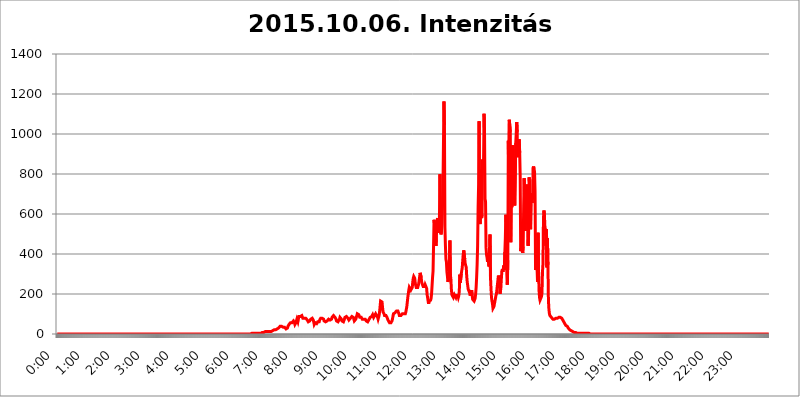
| Category | 2015.10.06. Intenzitás [W/m^2] |
|---|---|
| 0.0 | 0 |
| 0.0006944444444444445 | 0 |
| 0.001388888888888889 | 0 |
| 0.0020833333333333333 | 0 |
| 0.002777777777777778 | 0 |
| 0.003472222222222222 | 0 |
| 0.004166666666666667 | 0 |
| 0.004861111111111111 | 0 |
| 0.005555555555555556 | 0 |
| 0.0062499999999999995 | 0 |
| 0.006944444444444444 | 0 |
| 0.007638888888888889 | 0 |
| 0.008333333333333333 | 0 |
| 0.009027777777777779 | 0 |
| 0.009722222222222222 | 0 |
| 0.010416666666666666 | 0 |
| 0.011111111111111112 | 0 |
| 0.011805555555555555 | 0 |
| 0.012499999999999999 | 0 |
| 0.013194444444444444 | 0 |
| 0.013888888888888888 | 0 |
| 0.014583333333333332 | 0 |
| 0.015277777777777777 | 0 |
| 0.015972222222222224 | 0 |
| 0.016666666666666666 | 0 |
| 0.017361111111111112 | 0 |
| 0.018055555555555557 | 0 |
| 0.01875 | 0 |
| 0.019444444444444445 | 0 |
| 0.02013888888888889 | 0 |
| 0.020833333333333332 | 0 |
| 0.02152777777777778 | 0 |
| 0.022222222222222223 | 0 |
| 0.02291666666666667 | 0 |
| 0.02361111111111111 | 0 |
| 0.024305555555555556 | 0 |
| 0.024999999999999998 | 0 |
| 0.025694444444444447 | 0 |
| 0.02638888888888889 | 0 |
| 0.027083333333333334 | 0 |
| 0.027777777777777776 | 0 |
| 0.02847222222222222 | 0 |
| 0.029166666666666664 | 0 |
| 0.029861111111111113 | 0 |
| 0.030555555555555555 | 0 |
| 0.03125 | 0 |
| 0.03194444444444445 | 0 |
| 0.03263888888888889 | 0 |
| 0.03333333333333333 | 0 |
| 0.034027777777777775 | 0 |
| 0.034722222222222224 | 0 |
| 0.035416666666666666 | 0 |
| 0.036111111111111115 | 0 |
| 0.03680555555555556 | 0 |
| 0.0375 | 0 |
| 0.03819444444444444 | 0 |
| 0.03888888888888889 | 0 |
| 0.03958333333333333 | 0 |
| 0.04027777777777778 | 0 |
| 0.04097222222222222 | 0 |
| 0.041666666666666664 | 0 |
| 0.042361111111111106 | 0 |
| 0.04305555555555556 | 0 |
| 0.043750000000000004 | 0 |
| 0.044444444444444446 | 0 |
| 0.04513888888888889 | 0 |
| 0.04583333333333334 | 0 |
| 0.04652777777777778 | 0 |
| 0.04722222222222222 | 0 |
| 0.04791666666666666 | 0 |
| 0.04861111111111111 | 0 |
| 0.049305555555555554 | 0 |
| 0.049999999999999996 | 0 |
| 0.05069444444444445 | 0 |
| 0.051388888888888894 | 0 |
| 0.052083333333333336 | 0 |
| 0.05277777777777778 | 0 |
| 0.05347222222222222 | 0 |
| 0.05416666666666667 | 0 |
| 0.05486111111111111 | 0 |
| 0.05555555555555555 | 0 |
| 0.05625 | 0 |
| 0.05694444444444444 | 0 |
| 0.057638888888888885 | 0 |
| 0.05833333333333333 | 0 |
| 0.05902777777777778 | 0 |
| 0.059722222222222225 | 0 |
| 0.06041666666666667 | 0 |
| 0.061111111111111116 | 0 |
| 0.06180555555555556 | 0 |
| 0.0625 | 0 |
| 0.06319444444444444 | 0 |
| 0.06388888888888888 | 0 |
| 0.06458333333333334 | 0 |
| 0.06527777777777778 | 0 |
| 0.06597222222222222 | 0 |
| 0.06666666666666667 | 0 |
| 0.06736111111111111 | 0 |
| 0.06805555555555555 | 0 |
| 0.06874999999999999 | 0 |
| 0.06944444444444443 | 0 |
| 0.07013888888888889 | 0 |
| 0.07083333333333333 | 0 |
| 0.07152777777777779 | 0 |
| 0.07222222222222223 | 0 |
| 0.07291666666666667 | 0 |
| 0.07361111111111111 | 0 |
| 0.07430555555555556 | 0 |
| 0.075 | 0 |
| 0.07569444444444444 | 0 |
| 0.0763888888888889 | 0 |
| 0.07708333333333334 | 0 |
| 0.07777777777777778 | 0 |
| 0.07847222222222222 | 0 |
| 0.07916666666666666 | 0 |
| 0.0798611111111111 | 0 |
| 0.08055555555555556 | 0 |
| 0.08125 | 0 |
| 0.08194444444444444 | 0 |
| 0.08263888888888889 | 0 |
| 0.08333333333333333 | 0 |
| 0.08402777777777777 | 0 |
| 0.08472222222222221 | 0 |
| 0.08541666666666665 | 0 |
| 0.08611111111111112 | 0 |
| 0.08680555555555557 | 0 |
| 0.08750000000000001 | 0 |
| 0.08819444444444445 | 0 |
| 0.08888888888888889 | 0 |
| 0.08958333333333333 | 0 |
| 0.09027777777777778 | 0 |
| 0.09097222222222222 | 0 |
| 0.09166666666666667 | 0 |
| 0.09236111111111112 | 0 |
| 0.09305555555555556 | 0 |
| 0.09375 | 0 |
| 0.09444444444444444 | 0 |
| 0.09513888888888888 | 0 |
| 0.09583333333333333 | 0 |
| 0.09652777777777777 | 0 |
| 0.09722222222222222 | 0 |
| 0.09791666666666667 | 0 |
| 0.09861111111111111 | 0 |
| 0.09930555555555555 | 0 |
| 0.09999999999999999 | 0 |
| 0.10069444444444443 | 0 |
| 0.1013888888888889 | 0 |
| 0.10208333333333335 | 0 |
| 0.10277777777777779 | 0 |
| 0.10347222222222223 | 0 |
| 0.10416666666666667 | 0 |
| 0.10486111111111111 | 0 |
| 0.10555555555555556 | 0 |
| 0.10625 | 0 |
| 0.10694444444444444 | 0 |
| 0.1076388888888889 | 0 |
| 0.10833333333333334 | 0 |
| 0.10902777777777778 | 0 |
| 0.10972222222222222 | 0 |
| 0.1111111111111111 | 0 |
| 0.11180555555555556 | 0 |
| 0.11180555555555556 | 0 |
| 0.1125 | 0 |
| 0.11319444444444444 | 0 |
| 0.11388888888888889 | 0 |
| 0.11458333333333333 | 0 |
| 0.11527777777777777 | 0 |
| 0.11597222222222221 | 0 |
| 0.11666666666666665 | 0 |
| 0.1173611111111111 | 0 |
| 0.11805555555555557 | 0 |
| 0.11944444444444445 | 0 |
| 0.12013888888888889 | 0 |
| 0.12083333333333333 | 0 |
| 0.12152777777777778 | 0 |
| 0.12222222222222223 | 0 |
| 0.12291666666666667 | 0 |
| 0.12291666666666667 | 0 |
| 0.12361111111111112 | 0 |
| 0.12430555555555556 | 0 |
| 0.125 | 0 |
| 0.12569444444444444 | 0 |
| 0.12638888888888888 | 0 |
| 0.12708333333333333 | 0 |
| 0.16875 | 0 |
| 0.12847222222222224 | 0 |
| 0.12916666666666668 | 0 |
| 0.12986111111111112 | 0 |
| 0.13055555555555556 | 0 |
| 0.13125 | 0 |
| 0.13194444444444445 | 0 |
| 0.1326388888888889 | 0 |
| 0.13333333333333333 | 0 |
| 0.13402777777777777 | 0 |
| 0.13402777777777777 | 0 |
| 0.13472222222222222 | 0 |
| 0.13541666666666666 | 0 |
| 0.1361111111111111 | 0 |
| 0.13749999999999998 | 0 |
| 0.13819444444444443 | 0 |
| 0.1388888888888889 | 0 |
| 0.13958333333333334 | 0 |
| 0.14027777777777778 | 0 |
| 0.14097222222222222 | 0 |
| 0.14166666666666666 | 0 |
| 0.1423611111111111 | 0 |
| 0.14305555555555557 | 0 |
| 0.14375000000000002 | 0 |
| 0.14444444444444446 | 0 |
| 0.1451388888888889 | 0 |
| 0.1451388888888889 | 0 |
| 0.14652777777777778 | 0 |
| 0.14722222222222223 | 0 |
| 0.14791666666666667 | 0 |
| 0.1486111111111111 | 0 |
| 0.14930555555555555 | 0 |
| 0.15 | 0 |
| 0.15069444444444444 | 0 |
| 0.15138888888888888 | 0 |
| 0.15208333333333332 | 0 |
| 0.15277777777777776 | 0 |
| 0.15347222222222223 | 0 |
| 0.15416666666666667 | 0 |
| 0.15486111111111112 | 0 |
| 0.15555555555555556 | 0 |
| 0.15625 | 0 |
| 0.15694444444444444 | 0 |
| 0.15763888888888888 | 0 |
| 0.15833333333333333 | 0 |
| 0.15902777777777777 | 0 |
| 0.15972222222222224 | 0 |
| 0.16041666666666668 | 0 |
| 0.16111111111111112 | 0 |
| 0.16180555555555556 | 0 |
| 0.1625 | 0 |
| 0.16319444444444445 | 0 |
| 0.1638888888888889 | 0 |
| 0.16458333333333333 | 0 |
| 0.16527777777777777 | 0 |
| 0.16597222222222222 | 0 |
| 0.16666666666666666 | 0 |
| 0.1673611111111111 | 0 |
| 0.16805555555555554 | 0 |
| 0.16874999999999998 | 0 |
| 0.16944444444444443 | 0 |
| 0.17013888888888887 | 0 |
| 0.1708333333333333 | 0 |
| 0.17152777777777775 | 0 |
| 0.17222222222222225 | 0 |
| 0.1729166666666667 | 0 |
| 0.17361111111111113 | 0 |
| 0.17430555555555557 | 0 |
| 0.17500000000000002 | 0 |
| 0.17569444444444446 | 0 |
| 0.1763888888888889 | 0 |
| 0.17708333333333334 | 0 |
| 0.17777777777777778 | 0 |
| 0.17847222222222223 | 0 |
| 0.17916666666666667 | 0 |
| 0.1798611111111111 | 0 |
| 0.18055555555555555 | 0 |
| 0.18125 | 0 |
| 0.18194444444444444 | 0 |
| 0.1826388888888889 | 0 |
| 0.18333333333333335 | 0 |
| 0.1840277777777778 | 0 |
| 0.18472222222222223 | 0 |
| 0.18541666666666667 | 0 |
| 0.18611111111111112 | 0 |
| 0.18680555555555556 | 0 |
| 0.1875 | 0 |
| 0.18819444444444444 | 0 |
| 0.18888888888888888 | 0 |
| 0.18958333333333333 | 0 |
| 0.19027777777777777 | 0 |
| 0.1909722222222222 | 0 |
| 0.19166666666666665 | 0 |
| 0.19236111111111112 | 0 |
| 0.19305555555555554 | 0 |
| 0.19375 | 0 |
| 0.19444444444444445 | 0 |
| 0.1951388888888889 | 0 |
| 0.19583333333333333 | 0 |
| 0.19652777777777777 | 0 |
| 0.19722222222222222 | 0 |
| 0.19791666666666666 | 0 |
| 0.1986111111111111 | 0 |
| 0.19930555555555554 | 0 |
| 0.19999999999999998 | 0 |
| 0.20069444444444443 | 0 |
| 0.20138888888888887 | 0 |
| 0.2020833333333333 | 0 |
| 0.2027777777777778 | 0 |
| 0.2034722222222222 | 0 |
| 0.2041666666666667 | 0 |
| 0.20486111111111113 | 0 |
| 0.20555555555555557 | 0 |
| 0.20625000000000002 | 0 |
| 0.20694444444444446 | 0 |
| 0.2076388888888889 | 0 |
| 0.20833333333333334 | 0 |
| 0.20902777777777778 | 0 |
| 0.20972222222222223 | 0 |
| 0.21041666666666667 | 0 |
| 0.2111111111111111 | 0 |
| 0.21180555555555555 | 0 |
| 0.2125 | 0 |
| 0.21319444444444444 | 0 |
| 0.2138888888888889 | 0 |
| 0.21458333333333335 | 0 |
| 0.2152777777777778 | 0 |
| 0.21597222222222223 | 0 |
| 0.21666666666666667 | 0 |
| 0.21736111111111112 | 0 |
| 0.21805555555555556 | 0 |
| 0.21875 | 0 |
| 0.21944444444444444 | 0 |
| 0.22013888888888888 | 0 |
| 0.22083333333333333 | 0 |
| 0.22152777777777777 | 0 |
| 0.2222222222222222 | 0 |
| 0.22291666666666665 | 0 |
| 0.2236111111111111 | 0 |
| 0.22430555555555556 | 0 |
| 0.225 | 0 |
| 0.22569444444444445 | 0 |
| 0.2263888888888889 | 0 |
| 0.22708333333333333 | 0 |
| 0.22777777777777777 | 0 |
| 0.22847222222222222 | 0 |
| 0.22916666666666666 | 0 |
| 0.2298611111111111 | 0 |
| 0.23055555555555554 | 0 |
| 0.23124999999999998 | 0 |
| 0.23194444444444443 | 0 |
| 0.23263888888888887 | 0 |
| 0.2333333333333333 | 0 |
| 0.2340277777777778 | 0 |
| 0.2347222222222222 | 0 |
| 0.2354166666666667 | 0 |
| 0.23611111111111113 | 0 |
| 0.23680555555555557 | 0 |
| 0.23750000000000002 | 0 |
| 0.23819444444444446 | 0 |
| 0.2388888888888889 | 0 |
| 0.23958333333333334 | 0 |
| 0.24027777777777778 | 0 |
| 0.24097222222222223 | 0 |
| 0.24166666666666667 | 0 |
| 0.2423611111111111 | 0 |
| 0.24305555555555555 | 0 |
| 0.24375 | 0 |
| 0.24444444444444446 | 0 |
| 0.24513888888888888 | 0 |
| 0.24583333333333335 | 0 |
| 0.2465277777777778 | 0 |
| 0.24722222222222223 | 0 |
| 0.24791666666666667 | 0 |
| 0.24861111111111112 | 0 |
| 0.24930555555555556 | 0 |
| 0.25 | 0 |
| 0.25069444444444444 | 0 |
| 0.2513888888888889 | 0 |
| 0.2520833333333333 | 0 |
| 0.25277777777777777 | 0 |
| 0.2534722222222222 | 0 |
| 0.25416666666666665 | 0 |
| 0.2548611111111111 | 0 |
| 0.2555555555555556 | 0 |
| 0.25625000000000003 | 0 |
| 0.2569444444444445 | 0 |
| 0.2576388888888889 | 0 |
| 0.25833333333333336 | 0 |
| 0.2590277777777778 | 0 |
| 0.25972222222222224 | 0 |
| 0.2604166666666667 | 0 |
| 0.2611111111111111 | 0 |
| 0.26180555555555557 | 0 |
| 0.2625 | 0 |
| 0.26319444444444445 | 0 |
| 0.2638888888888889 | 0 |
| 0.26458333333333334 | 0 |
| 0.2652777777777778 | 0 |
| 0.2659722222222222 | 0 |
| 0.26666666666666666 | 0 |
| 0.2673611111111111 | 0 |
| 0.26805555555555555 | 0 |
| 0.26875 | 0 |
| 0.26944444444444443 | 0 |
| 0.2701388888888889 | 0 |
| 0.2708333333333333 | 0 |
| 0.27152777777777776 | 0 |
| 0.2722222222222222 | 0 |
| 0.27291666666666664 | 3.525 |
| 0.2736111111111111 | 0 |
| 0.2743055555555555 | 3.525 |
| 0.27499999999999997 | 3.525 |
| 0.27569444444444446 | 3.525 |
| 0.27638888888888885 | 3.525 |
| 0.27708333333333335 | 3.525 |
| 0.2777777777777778 | 3.525 |
| 0.27847222222222223 | 3.525 |
| 0.2791666666666667 | 3.525 |
| 0.2798611111111111 | 3.525 |
| 0.28055555555555556 | 3.525 |
| 0.28125 | 3.525 |
| 0.28194444444444444 | 3.525 |
| 0.2826388888888889 | 3.525 |
| 0.2833333333333333 | 3.525 |
| 0.28402777777777777 | 3.525 |
| 0.2847222222222222 | 3.525 |
| 0.28541666666666665 | 3.525 |
| 0.28611111111111115 | 3.525 |
| 0.28680555555555554 | 7.887 |
| 0.28750000000000003 | 7.887 |
| 0.2881944444444445 | 7.887 |
| 0.2888888888888889 | 7.887 |
| 0.28958333333333336 | 7.887 |
| 0.2902777777777778 | 7.887 |
| 0.29097222222222224 | 7.887 |
| 0.2916666666666667 | 12.257 |
| 0.2923611111111111 | 12.257 |
| 0.29305555555555557 | 12.257 |
| 0.29375 | 12.257 |
| 0.29444444444444445 | 12.257 |
| 0.2951388888888889 | 12.257 |
| 0.29583333333333334 | 12.257 |
| 0.2965277777777778 | 12.257 |
| 0.2972222222222222 | 12.257 |
| 0.29791666666666666 | 12.257 |
| 0.2986111111111111 | 12.257 |
| 0.29930555555555555 | 12.257 |
| 0.3 | 12.257 |
| 0.30069444444444443 | 12.257 |
| 0.3013888888888889 | 16.636 |
| 0.3020833333333333 | 16.636 |
| 0.30277777777777776 | 16.636 |
| 0.3034722222222222 | 16.636 |
| 0.30416666666666664 | 21.024 |
| 0.3048611111111111 | 21.024 |
| 0.3055555555555555 | 21.024 |
| 0.30624999999999997 | 21.024 |
| 0.3069444444444444 | 21.024 |
| 0.3076388888888889 | 25.419 |
| 0.30833333333333335 | 25.419 |
| 0.3090277777777778 | 25.419 |
| 0.30972222222222223 | 29.823 |
| 0.3104166666666667 | 29.823 |
| 0.3111111111111111 | 29.823 |
| 0.31180555555555556 | 34.234 |
| 0.3125 | 38.653 |
| 0.31319444444444444 | 38.653 |
| 0.3138888888888889 | 38.653 |
| 0.3145833333333333 | 38.653 |
| 0.31527777777777777 | 38.653 |
| 0.3159722222222222 | 38.653 |
| 0.31666666666666665 | 34.234 |
| 0.31736111111111115 | 34.234 |
| 0.31805555555555554 | 34.234 |
| 0.31875000000000003 | 34.234 |
| 0.3194444444444445 | 29.823 |
| 0.3201388888888889 | 29.823 |
| 0.32083333333333336 | 25.419 |
| 0.3215277777777778 | 29.823 |
| 0.32222222222222224 | 29.823 |
| 0.3229166666666667 | 29.823 |
| 0.3236111111111111 | 38.653 |
| 0.32430555555555557 | 43.079 |
| 0.325 | 47.511 |
| 0.32569444444444445 | 47.511 |
| 0.3263888888888889 | 47.511 |
| 0.32708333333333334 | 56.398 |
| 0.3277777777777778 | 56.398 |
| 0.3284722222222222 | 56.398 |
| 0.32916666666666666 | 56.398 |
| 0.3298611111111111 | 56.398 |
| 0.33055555555555555 | 60.85 |
| 0.33125 | 65.31 |
| 0.33194444444444443 | 65.31 |
| 0.3326388888888889 | 56.398 |
| 0.3333333333333333 | 47.511 |
| 0.3340277777777778 | 47.511 |
| 0.3347222222222222 | 56.398 |
| 0.3354166666666667 | 65.31 |
| 0.3361111111111111 | 74.246 |
| 0.3368055555555556 | 74.246 |
| 0.33749999999999997 | 60.85 |
| 0.33819444444444446 | 74.246 |
| 0.33888888888888885 | 87.692 |
| 0.33958333333333335 | 87.692 |
| 0.34027777777777773 | 83.205 |
| 0.34097222222222223 | 87.692 |
| 0.3416666666666666 | 87.692 |
| 0.3423611111111111 | 87.692 |
| 0.3430555555555555 | 92.184 |
| 0.34375 | 87.692 |
| 0.3444444444444445 | 78.722 |
| 0.3451388888888889 | 78.722 |
| 0.3458333333333334 | 78.722 |
| 0.34652777777777777 | 78.722 |
| 0.34722222222222227 | 78.722 |
| 0.34791666666666665 | 83.205 |
| 0.34861111111111115 | 78.722 |
| 0.34930555555555554 | 74.246 |
| 0.35000000000000003 | 74.246 |
| 0.3506944444444444 | 69.775 |
| 0.3513888888888889 | 65.31 |
| 0.3520833333333333 | 60.85 |
| 0.3527777777777778 | 56.398 |
| 0.3534722222222222 | 60.85 |
| 0.3541666666666667 | 65.31 |
| 0.3548611111111111 | 65.31 |
| 0.35555555555555557 | 74.246 |
| 0.35625 | 74.246 |
| 0.35694444444444445 | 78.722 |
| 0.3576388888888889 | 78.722 |
| 0.35833333333333334 | 74.246 |
| 0.3590277777777778 | 69.775 |
| 0.3597222222222222 | 60.85 |
| 0.36041666666666666 | 47.511 |
| 0.3611111111111111 | 51.951 |
| 0.36180555555555555 | 56.398 |
| 0.3625 | 51.951 |
| 0.36319444444444443 | 51.951 |
| 0.3638888888888889 | 51.951 |
| 0.3645833333333333 | 56.398 |
| 0.3652777777777778 | 60.85 |
| 0.3659722222222222 | 60.85 |
| 0.3666666666666667 | 56.398 |
| 0.3673611111111111 | 60.85 |
| 0.3680555555555556 | 69.775 |
| 0.36874999999999997 | 74.246 |
| 0.36944444444444446 | 78.722 |
| 0.37013888888888885 | 78.722 |
| 0.37083333333333335 | 78.722 |
| 0.37152777777777773 | 78.722 |
| 0.37222222222222223 | 74.246 |
| 0.3729166666666666 | 74.246 |
| 0.3736111111111111 | 74.246 |
| 0.3743055555555555 | 65.31 |
| 0.375 | 60.85 |
| 0.3756944444444445 | 60.85 |
| 0.3763888888888889 | 60.85 |
| 0.3770833333333334 | 65.31 |
| 0.37777777777777777 | 60.85 |
| 0.37847222222222227 | 65.31 |
| 0.37916666666666665 | 65.31 |
| 0.37986111111111115 | 69.775 |
| 0.38055555555555554 | 74.246 |
| 0.38125000000000003 | 74.246 |
| 0.3819444444444444 | 74.246 |
| 0.3826388888888889 | 69.775 |
| 0.3833333333333333 | 69.775 |
| 0.3840277777777778 | 69.775 |
| 0.3847222222222222 | 74.246 |
| 0.3854166666666667 | 83.205 |
| 0.3861111111111111 | 83.205 |
| 0.38680555555555557 | 78.722 |
| 0.3875 | 92.184 |
| 0.38819444444444445 | 92.184 |
| 0.3888888888888889 | 92.184 |
| 0.38958333333333334 | 83.205 |
| 0.3902777777777778 | 78.722 |
| 0.3909722222222222 | 74.246 |
| 0.39166666666666666 | 65.31 |
| 0.3923611111111111 | 65.31 |
| 0.39305555555555555 | 65.31 |
| 0.39375 | 60.85 |
| 0.39444444444444443 | 65.31 |
| 0.3951388888888889 | 65.31 |
| 0.3958333333333333 | 74.246 |
| 0.3965277777777778 | 83.205 |
| 0.3972222222222222 | 87.692 |
| 0.3979166666666667 | 78.722 |
| 0.3986111111111111 | 74.246 |
| 0.3993055555555556 | 65.31 |
| 0.39999999999999997 | 65.31 |
| 0.40069444444444446 | 65.31 |
| 0.40138888888888885 | 60.85 |
| 0.40208333333333335 | 65.31 |
| 0.40277777777777773 | 74.246 |
| 0.40347222222222223 | 83.205 |
| 0.4041666666666666 | 83.205 |
| 0.4048611111111111 | 87.692 |
| 0.4055555555555555 | 87.692 |
| 0.40625 | 83.205 |
| 0.4069444444444445 | 83.205 |
| 0.4076388888888889 | 78.722 |
| 0.4083333333333334 | 74.246 |
| 0.40902777777777777 | 69.775 |
| 0.40972222222222227 | 69.775 |
| 0.41041666666666665 | 74.246 |
| 0.41111111111111115 | 78.722 |
| 0.41180555555555554 | 78.722 |
| 0.41250000000000003 | 83.205 |
| 0.4131944444444444 | 87.692 |
| 0.4138888888888889 | 92.184 |
| 0.4145833333333333 | 87.692 |
| 0.4152777777777778 | 83.205 |
| 0.4159722222222222 | 74.246 |
| 0.4166666666666667 | 65.31 |
| 0.4173611111111111 | 65.31 |
| 0.41805555555555557 | 69.775 |
| 0.41875 | 74.246 |
| 0.41944444444444445 | 83.205 |
| 0.4201388888888889 | 92.184 |
| 0.42083333333333334 | 101.184 |
| 0.4215277777777778 | 105.69 |
| 0.4222222222222222 | 101.184 |
| 0.42291666666666666 | 96.682 |
| 0.4236111111111111 | 92.184 |
| 0.42430555555555555 | 83.205 |
| 0.425 | 83.205 |
| 0.42569444444444443 | 83.205 |
| 0.4263888888888889 | 83.205 |
| 0.4270833333333333 | 83.205 |
| 0.4277777777777778 | 74.246 |
| 0.4284722222222222 | 74.246 |
| 0.4291666666666667 | 74.246 |
| 0.4298611111111111 | 74.246 |
| 0.4305555555555556 | 74.246 |
| 0.43124999999999997 | 69.775 |
| 0.43194444444444446 | 74.246 |
| 0.43263888888888885 | 69.775 |
| 0.43333333333333335 | 65.31 |
| 0.43402777777777773 | 65.31 |
| 0.43472222222222223 | 60.85 |
| 0.4354166666666666 | 60.85 |
| 0.4361111111111111 | 65.31 |
| 0.4368055555555555 | 65.31 |
| 0.4375 | 74.246 |
| 0.4381944444444445 | 78.722 |
| 0.4388888888888889 | 83.205 |
| 0.4395833333333334 | 87.692 |
| 0.44027777777777777 | 83.205 |
| 0.44097222222222227 | 87.692 |
| 0.44166666666666665 | 92.184 |
| 0.44236111111111115 | 96.682 |
| 0.44305555555555554 | 92.184 |
| 0.44375000000000003 | 83.205 |
| 0.4444444444444444 | 83.205 |
| 0.4451388888888889 | 92.184 |
| 0.4458333333333333 | 96.682 |
| 0.4465277777777778 | 101.184 |
| 0.4472222222222222 | 101.184 |
| 0.4479166666666667 | 92.184 |
| 0.4486111111111111 | 87.692 |
| 0.44930555555555557 | 83.205 |
| 0.45 | 74.246 |
| 0.45069444444444445 | 74.246 |
| 0.4513888888888889 | 92.184 |
| 0.45208333333333334 | 110.201 |
| 0.4527777777777778 | 137.347 |
| 0.4534722222222222 | 164.605 |
| 0.45416666666666666 | 160.056 |
| 0.4548611111111111 | 160.056 |
| 0.45555555555555555 | 160.056 |
| 0.45625 | 132.814 |
| 0.45694444444444443 | 110.201 |
| 0.4576388888888889 | 110.201 |
| 0.4583333333333333 | 101.184 |
| 0.4590277777777778 | 92.184 |
| 0.4597222222222222 | 92.184 |
| 0.4604166666666667 | 92.184 |
| 0.4611111111111111 | 92.184 |
| 0.4618055555555556 | 87.692 |
| 0.46249999999999997 | 83.205 |
| 0.46319444444444446 | 78.722 |
| 0.46388888888888885 | 69.775 |
| 0.46458333333333335 | 65.31 |
| 0.46527777777777773 | 65.31 |
| 0.46597222222222223 | 56.398 |
| 0.4666666666666666 | 56.398 |
| 0.4673611111111111 | 56.398 |
| 0.4680555555555555 | 56.398 |
| 0.46875 | 56.398 |
| 0.4694444444444445 | 65.31 |
| 0.4701388888888889 | 74.246 |
| 0.4708333333333334 | 87.692 |
| 0.47152777777777777 | 101.184 |
| 0.47222222222222227 | 105.69 |
| 0.47291666666666665 | 105.69 |
| 0.47361111111111115 | 105.69 |
| 0.47430555555555554 | 105.69 |
| 0.47500000000000003 | 110.201 |
| 0.4756944444444444 | 114.716 |
| 0.4763888888888889 | 119.235 |
| 0.4770833333333333 | 119.235 |
| 0.4777777777777778 | 114.716 |
| 0.4784722222222222 | 110.201 |
| 0.4791666666666667 | 101.184 |
| 0.4798611111111111 | 92.184 |
| 0.48055555555555557 | 92.184 |
| 0.48125 | 92.184 |
| 0.48194444444444445 | 92.184 |
| 0.4826388888888889 | 92.184 |
| 0.48333333333333334 | 96.682 |
| 0.4840277777777778 | 101.184 |
| 0.4847222222222222 | 101.184 |
| 0.48541666666666666 | 101.184 |
| 0.4861111111111111 | 101.184 |
| 0.48680555555555555 | 101.184 |
| 0.4875 | 101.184 |
| 0.48819444444444443 | 101.184 |
| 0.4888888888888889 | 110.201 |
| 0.4895833333333333 | 123.758 |
| 0.4902777777777778 | 137.347 |
| 0.4909722222222222 | 160.056 |
| 0.4916666666666667 | 182.82 |
| 0.4923611111111111 | 201.058 |
| 0.4930555555555556 | 219.309 |
| 0.49374999999999997 | 233 |
| 0.49444444444444446 | 237.564 |
| 0.49513888888888885 | 228.436 |
| 0.49583333333333335 | 219.309 |
| 0.49652777777777773 | 214.746 |
| 0.49722222222222223 | 219.309 |
| 0.4979166666666666 | 233 |
| 0.4986111111111111 | 260.373 |
| 0.4993055555555555 | 278.603 |
| 0.5 | 287.709 |
| 0.5006944444444444 | 287.709 |
| 0.5013888888888889 | 278.603 |
| 0.5020833333333333 | 255.813 |
| 0.5027777777777778 | 242.127 |
| 0.5034722222222222 | 233 |
| 0.5041666666666667 | 237.564 |
| 0.5048611111111111 | 237.564 |
| 0.5055555555555555 | 233 |
| 0.50625 | 233 |
| 0.5069444444444444 | 251.251 |
| 0.5076388888888889 | 269.49 |
| 0.5083333333333333 | 287.709 |
| 0.5090277777777777 | 305.898 |
| 0.5097222222222222 | 305.898 |
| 0.5104166666666666 | 283.156 |
| 0.5111111111111112 | 260.373 |
| 0.5118055555555555 | 251.251 |
| 0.5125000000000001 | 246.689 |
| 0.5131944444444444 | 237.564 |
| 0.513888888888889 | 233 |
| 0.5145833333333333 | 233 |
| 0.5152777777777778 | 237.564 |
| 0.5159722222222222 | 246.689 |
| 0.5166666666666667 | 246.689 |
| 0.517361111111111 | 242.127 |
| 0.5180555555555556 | 228.436 |
| 0.5187499999999999 | 196.497 |
| 0.5194444444444445 | 182.82 |
| 0.5201388888888888 | 164.605 |
| 0.5208333333333334 | 150.964 |
| 0.5215277777777778 | 164.605 |
| 0.5222222222222223 | 169.156 |
| 0.5229166666666667 | 169.156 |
| 0.5236111111111111 | 169.156 |
| 0.5243055555555556 | 178.264 |
| 0.525 | 201.058 |
| 0.5256944444444445 | 242.127 |
| 0.5263888888888889 | 283.156 |
| 0.5270833333333333 | 314.98 |
| 0.5277777777777778 | 440.702 |
| 0.5284722222222222 | 571.049 |
| 0.5291666666666667 | 575.299 |
| 0.5298611111111111 | 528.2 |
| 0.5305555555555556 | 480.356 |
| 0.53125 | 440.702 |
| 0.5319444444444444 | 523.88 |
| 0.5326388888888889 | 566.793 |
| 0.5333333333333333 | 579.542 |
| 0.5340277777777778 | 523.88 |
| 0.5347222222222222 | 541.121 |
| 0.5354166666666667 | 506.542 |
| 0.5361111111111111 | 600.661 |
| 0.5368055555555555 | 798.974 |
| 0.5375 | 553.986 |
| 0.5381944444444444 | 497.836 |
| 0.5388888888888889 | 515.223 |
| 0.5395833333333333 | 549.704 |
| 0.5402777777777777 | 634.105 |
| 0.5409722222222222 | 727.896 |
| 0.5416666666666666 | 723.889 |
| 0.5423611111111112 | 1162.571 |
| 0.5430555555555555 | 1044.762 |
| 0.5437500000000001 | 532.513 |
| 0.5444444444444444 | 440.702 |
| 0.545138888888889 | 373.729 |
| 0.5458333333333333 | 360.221 |
| 0.5465277777777778 | 310.44 |
| 0.5472222222222222 | 287.709 |
| 0.5479166666666667 | 260.373 |
| 0.548611111111111 | 269.49 |
| 0.5493055555555556 | 283.156 |
| 0.5499999999999999 | 287.709 |
| 0.5506944444444445 | 467.187 |
| 0.5513888888888888 | 296.808 |
| 0.5520833333333334 | 274.047 |
| 0.5527777777777778 | 223.873 |
| 0.5534722222222223 | 196.497 |
| 0.5541666666666667 | 191.937 |
| 0.5548611111111111 | 191.937 |
| 0.5555555555555556 | 182.82 |
| 0.55625 | 187.378 |
| 0.5569444444444445 | 196.497 |
| 0.5576388888888889 | 201.058 |
| 0.5583333333333333 | 191.937 |
| 0.5590277777777778 | 182.82 |
| 0.5597222222222222 | 191.937 |
| 0.5604166666666667 | 191.937 |
| 0.5611111111111111 | 191.937 |
| 0.5618055555555556 | 191.937 |
| 0.5625 | 182.82 |
| 0.5631944444444444 | 191.937 |
| 0.5638888888888889 | 214.746 |
| 0.5645833333333333 | 296.808 |
| 0.5652777777777778 | 255.813 |
| 0.5659722222222222 | 260.373 |
| 0.5666666666666667 | 301.354 |
| 0.5673611111111111 | 296.808 |
| 0.5680555555555555 | 333.113 |
| 0.56875 | 369.23 |
| 0.5694444444444444 | 400.638 |
| 0.5701388888888889 | 418.492 |
| 0.5708333333333333 | 422.943 |
| 0.5715277777777777 | 373.729 |
| 0.5722222222222222 | 351.198 |
| 0.5729166666666666 | 346.682 |
| 0.5736111111111112 | 333.113 |
| 0.5743055555555555 | 287.709 |
| 0.5750000000000001 | 260.373 |
| 0.5756944444444444 | 242.127 |
| 0.576388888888889 | 223.873 |
| 0.5770833333333333 | 228.436 |
| 0.5777777777777778 | 223.873 |
| 0.5784722222222222 | 205.62 |
| 0.5791666666666667 | 191.937 |
| 0.579861111111111 | 187.378 |
| 0.5805555555555556 | 191.937 |
| 0.5812499999999999 | 219.309 |
| 0.5819444444444445 | 191.937 |
| 0.5826388888888888 | 173.709 |
| 0.5833333333333334 | 173.709 |
| 0.5840277777777778 | 169.156 |
| 0.5847222222222223 | 164.605 |
| 0.5854166666666667 | 164.605 |
| 0.5861111111111111 | 178.264 |
| 0.5868055555555556 | 201.058 |
| 0.5875 | 233 |
| 0.5881944444444445 | 283.156 |
| 0.5888888888888889 | 346.682 |
| 0.5895833333333333 | 440.702 |
| 0.5902777777777778 | 634.105 |
| 0.5909722222222222 | 747.834 |
| 0.5916666666666667 | 1063.51 |
| 0.5923611111111111 | 571.049 |
| 0.5930555555555556 | 549.704 |
| 0.59375 | 600.661 |
| 0.5944444444444444 | 822.26 |
| 0.5951388888888889 | 579.542 |
| 0.5958333333333333 | 596.45 |
| 0.5965277777777778 | 872.114 |
| 0.5972222222222222 | 822.26 |
| 0.5979166666666667 | 864.493 |
| 0.5986111111111111 | 1101.226 |
| 0.5993055555555555 | 996.182 |
| 0.6 | 675.311 |
| 0.6006944444444444 | 663.019 |
| 0.6013888888888889 | 431.833 |
| 0.6020833333333333 | 396.164 |
| 0.6027777777777777 | 382.715 |
| 0.6034722222222222 | 360.221 |
| 0.6041666666666666 | 405.108 |
| 0.6048611111111112 | 360.221 |
| 0.6055555555555555 | 337.639 |
| 0.6062500000000001 | 414.035 |
| 0.6069444444444444 | 497.836 |
| 0.607638888888889 | 283.156 |
| 0.6083333333333333 | 228.436 |
| 0.6090277777777778 | 182.82 |
| 0.6097222222222222 | 164.605 |
| 0.6104166666666667 | 150.964 |
| 0.611111111111111 | 128.284 |
| 0.6118055555555556 | 123.758 |
| 0.6124999999999999 | 137.347 |
| 0.6131944444444445 | 150.964 |
| 0.6138888888888888 | 164.605 |
| 0.6145833333333334 | 178.264 |
| 0.6152777777777778 | 191.937 |
| 0.6159722222222223 | 201.058 |
| 0.6166666666666667 | 223.873 |
| 0.6173611111111111 | 246.689 |
| 0.6180555555555556 | 269.49 |
| 0.61875 | 292.259 |
| 0.6194444444444445 | 292.259 |
| 0.6201388888888889 | 251.251 |
| 0.6208333333333333 | 201.058 |
| 0.6215277777777778 | 210.182 |
| 0.6222222222222222 | 233 |
| 0.6229166666666667 | 278.603 |
| 0.6236111111111111 | 314.98 |
| 0.6243055555555556 | 324.052 |
| 0.625 | 310.44 |
| 0.6256944444444444 | 305.898 |
| 0.6263888888888889 | 342.162 |
| 0.6270833333333333 | 319.517 |
| 0.6277777777777778 | 409.574 |
| 0.6284722222222222 | 480.356 |
| 0.6291666666666667 | 596.45 |
| 0.6298611111111111 | 532.513 |
| 0.6305555555555555 | 296.808 |
| 0.63125 | 246.689 |
| 0.6319444444444444 | 369.23 |
| 0.6326388888888889 | 966.295 |
| 0.6333333333333333 | 743.859 |
| 0.6340277777777777 | 1071.027 |
| 0.6347222222222222 | 1074.789 |
| 0.6354166666666666 | 1011.118 |
| 0.6361111111111112 | 458.38 |
| 0.6368055555555555 | 735.89 |
| 0.6375000000000001 | 634.105 |
| 0.6381944444444444 | 932.576 |
| 0.638888888888889 | 943.832 |
| 0.6395833333333333 | 837.682 |
| 0.6402777777777778 | 883.516 |
| 0.6409722222222222 | 727.896 |
| 0.6416666666666667 | 642.4 |
| 0.642361111111111 | 638.256 |
| 0.6430555555555556 | 955.071 |
| 0.6437499999999999 | 1003.65 |
| 0.6444444444444445 | 1059.756 |
| 0.6451388888888888 | 1011.118 |
| 0.6458333333333334 | 883.516 |
| 0.6465277777777778 | 883.516 |
| 0.6472222222222223 | 958.814 |
| 0.6479166666666667 | 973.772 |
| 0.6486111111111111 | 906.223 |
| 0.6493055555555556 | 787.258 |
| 0.65 | 414.035 |
| 0.6506944444444445 | 431.833 |
| 0.6513888888888889 | 484.735 |
| 0.6520833333333333 | 480.356 |
| 0.6527777777777778 | 405.108 |
| 0.6534722222222222 | 436.27 |
| 0.6541666666666667 | 638.256 |
| 0.6548611111111111 | 779.42 |
| 0.6555555555555556 | 775.492 |
| 0.65625 | 515.223 |
| 0.6569444444444444 | 515.223 |
| 0.6576388888888889 | 658.909 |
| 0.6583333333333333 | 747.834 |
| 0.6590277777777778 | 634.105 |
| 0.6597222222222222 | 691.608 |
| 0.6604166666666667 | 440.702 |
| 0.6611111111111111 | 502.192 |
| 0.6618055555555555 | 783.342 |
| 0.6625 | 747.834 |
| 0.6631944444444444 | 650.667 |
| 0.6638888888888889 | 523.88 |
| 0.6645833333333333 | 703.762 |
| 0.6652777777777777 | 687.544 |
| 0.6659722222222222 | 654.791 |
| 0.6666666666666666 | 687.544 |
| 0.6673611111111111 | 829.981 |
| 0.6680555555555556 | 837.682 |
| 0.6687500000000001 | 826.123 |
| 0.6694444444444444 | 810.641 |
| 0.6701388888888888 | 711.832 |
| 0.6708333333333334 | 319.517 |
| 0.6715277777777778 | 328.584 |
| 0.6722222222222222 | 431.833 |
| 0.6729166666666666 | 333.113 |
| 0.6736111111111112 | 260.373 |
| 0.6743055555555556 | 506.542 |
| 0.6749999999999999 | 333.113 |
| 0.6756944444444444 | 219.309 |
| 0.6763888888888889 | 182.82 |
| 0.6770833333333334 | 169.156 |
| 0.6777777777777777 | 164.605 |
| 0.6784722222222223 | 173.709 |
| 0.6791666666666667 | 187.378 |
| 0.6798611111111111 | 205.62 |
| 0.6805555555555555 | 310.44 |
| 0.68125 | 351.198 |
| 0.6819444444444445 | 579.542 |
| 0.6826388888888889 | 617.436 |
| 0.6833333333333332 | 588.009 |
| 0.6840277777777778 | 532.513 |
| 0.6847222222222222 | 523.88 |
| 0.6854166666666667 | 440.702 |
| 0.686111111111111 | 523.88 |
| 0.6868055555555556 | 333.113 |
| 0.6875 | 480.356 |
| 0.6881944444444444 | 346.682 |
| 0.688888888888889 | 169.156 |
| 0.6895833333333333 | 123.758 |
| 0.6902777777777778 | 101.184 |
| 0.6909722222222222 | 92.184 |
| 0.6916666666666668 | 87.692 |
| 0.6923611111111111 | 96.682 |
| 0.6930555555555555 | 83.205 |
| 0.69375 | 83.205 |
| 0.6944444444444445 | 78.722 |
| 0.6951388888888889 | 74.246 |
| 0.6958333333333333 | 74.246 |
| 0.6965277777777777 | 74.246 |
| 0.6972222222222223 | 74.246 |
| 0.6979166666666666 | 74.246 |
| 0.6986111111111111 | 78.722 |
| 0.6993055555555556 | 78.722 |
| 0.7000000000000001 | 83.205 |
| 0.7006944444444444 | 78.722 |
| 0.7013888888888888 | 78.722 |
| 0.7020833333333334 | 83.205 |
| 0.7027777777777778 | 83.205 |
| 0.7034722222222222 | 83.205 |
| 0.7041666666666666 | 87.692 |
| 0.7048611111111112 | 87.692 |
| 0.7055555555555556 | 83.205 |
| 0.7062499999999999 | 83.205 |
| 0.7069444444444444 | 83.205 |
| 0.7076388888888889 | 78.722 |
| 0.7083333333333334 | 74.246 |
| 0.7090277777777777 | 69.775 |
| 0.7097222222222223 | 65.31 |
| 0.7104166666666667 | 60.85 |
| 0.7111111111111111 | 56.398 |
| 0.7118055555555555 | 51.951 |
| 0.7125 | 47.511 |
| 0.7131944444444445 | 43.079 |
| 0.7138888888888889 | 38.653 |
| 0.7145833333333332 | 38.653 |
| 0.7152777777777778 | 38.653 |
| 0.7159722222222222 | 34.234 |
| 0.7166666666666667 | 29.823 |
| 0.717361111111111 | 29.823 |
| 0.7180555555555556 | 25.419 |
| 0.71875 | 21.024 |
| 0.7194444444444444 | 21.024 |
| 0.720138888888889 | 21.024 |
| 0.7208333333333333 | 16.636 |
| 0.7215277777777778 | 16.636 |
| 0.7222222222222222 | 12.257 |
| 0.7229166666666668 | 12.257 |
| 0.7236111111111111 | 12.257 |
| 0.7243055555555555 | 12.257 |
| 0.725 | 7.887 |
| 0.7256944444444445 | 7.887 |
| 0.7263888888888889 | 7.887 |
| 0.7270833333333333 | 7.887 |
| 0.7277777777777777 | 7.887 |
| 0.7284722222222223 | 7.887 |
| 0.7291666666666666 | 3.525 |
| 0.7298611111111111 | 3.525 |
| 0.7305555555555556 | 3.525 |
| 0.7312500000000001 | 3.525 |
| 0.7319444444444444 | 3.525 |
| 0.7326388888888888 | 3.525 |
| 0.7333333333333334 | 3.525 |
| 0.7340277777777778 | 3.525 |
| 0.7347222222222222 | 3.525 |
| 0.7354166666666666 | 3.525 |
| 0.7361111111111112 | 3.525 |
| 0.7368055555555556 | 3.525 |
| 0.7374999999999999 | 3.525 |
| 0.7381944444444444 | 3.525 |
| 0.7388888888888889 | 3.525 |
| 0.7395833333333334 | 3.525 |
| 0.7402777777777777 | 3.525 |
| 0.7409722222222223 | 3.525 |
| 0.7416666666666667 | 3.525 |
| 0.7423611111111111 | 3.525 |
| 0.7430555555555555 | 3.525 |
| 0.74375 | 3.525 |
| 0.7444444444444445 | 3.525 |
| 0.7451388888888889 | 3.525 |
| 0.7458333333333332 | 3.525 |
| 0.7465277777777778 | 3.525 |
| 0.7472222222222222 | 3.525 |
| 0.7479166666666667 | 0 |
| 0.748611111111111 | 0 |
| 0.7493055555555556 | 0 |
| 0.75 | 0 |
| 0.7506944444444444 | 0 |
| 0.751388888888889 | 0 |
| 0.7520833333333333 | 0 |
| 0.7527777777777778 | 0 |
| 0.7534722222222222 | 0 |
| 0.7541666666666668 | 0 |
| 0.7548611111111111 | 0 |
| 0.7555555555555555 | 0 |
| 0.75625 | 0 |
| 0.7569444444444445 | 0 |
| 0.7576388888888889 | 0 |
| 0.7583333333333333 | 0 |
| 0.7590277777777777 | 0 |
| 0.7597222222222223 | 0 |
| 0.7604166666666666 | 0 |
| 0.7611111111111111 | 0 |
| 0.7618055555555556 | 0 |
| 0.7625000000000001 | 0 |
| 0.7631944444444444 | 0 |
| 0.7638888888888888 | 0 |
| 0.7645833333333334 | 0 |
| 0.7652777777777778 | 0 |
| 0.7659722222222222 | 0 |
| 0.7666666666666666 | 0 |
| 0.7673611111111112 | 0 |
| 0.7680555555555556 | 0 |
| 0.7687499999999999 | 0 |
| 0.7694444444444444 | 0 |
| 0.7701388888888889 | 0 |
| 0.7708333333333334 | 0 |
| 0.7715277777777777 | 0 |
| 0.7722222222222223 | 0 |
| 0.7729166666666667 | 0 |
| 0.7736111111111111 | 0 |
| 0.7743055555555555 | 0 |
| 0.775 | 0 |
| 0.7756944444444445 | 0 |
| 0.7763888888888889 | 0 |
| 0.7770833333333332 | 0 |
| 0.7777777777777778 | 0 |
| 0.7784722222222222 | 0 |
| 0.7791666666666667 | 0 |
| 0.779861111111111 | 0 |
| 0.7805555555555556 | 0 |
| 0.78125 | 0 |
| 0.7819444444444444 | 0 |
| 0.782638888888889 | 0 |
| 0.7833333333333333 | 0 |
| 0.7840277777777778 | 0 |
| 0.7847222222222222 | 0 |
| 0.7854166666666668 | 0 |
| 0.7861111111111111 | 0 |
| 0.7868055555555555 | 0 |
| 0.7875 | 0 |
| 0.7881944444444445 | 0 |
| 0.7888888888888889 | 0 |
| 0.7895833333333333 | 0 |
| 0.7902777777777777 | 0 |
| 0.7909722222222223 | 0 |
| 0.7916666666666666 | 0 |
| 0.7923611111111111 | 0 |
| 0.7930555555555556 | 0 |
| 0.7937500000000001 | 0 |
| 0.7944444444444444 | 0 |
| 0.7951388888888888 | 0 |
| 0.7958333333333334 | 0 |
| 0.7965277777777778 | 0 |
| 0.7972222222222222 | 0 |
| 0.7979166666666666 | 0 |
| 0.7986111111111112 | 0 |
| 0.7993055555555556 | 0 |
| 0.7999999999999999 | 0 |
| 0.8006944444444444 | 0 |
| 0.8013888888888889 | 0 |
| 0.8020833333333334 | 0 |
| 0.8027777777777777 | 0 |
| 0.8034722222222223 | 0 |
| 0.8041666666666667 | 0 |
| 0.8048611111111111 | 0 |
| 0.8055555555555555 | 0 |
| 0.80625 | 0 |
| 0.8069444444444445 | 0 |
| 0.8076388888888889 | 0 |
| 0.8083333333333332 | 0 |
| 0.8090277777777778 | 0 |
| 0.8097222222222222 | 0 |
| 0.8104166666666667 | 0 |
| 0.811111111111111 | 0 |
| 0.8118055555555556 | 0 |
| 0.8125 | 0 |
| 0.8131944444444444 | 0 |
| 0.813888888888889 | 0 |
| 0.8145833333333333 | 0 |
| 0.8152777777777778 | 0 |
| 0.8159722222222222 | 0 |
| 0.8166666666666668 | 0 |
| 0.8173611111111111 | 0 |
| 0.8180555555555555 | 0 |
| 0.81875 | 0 |
| 0.8194444444444445 | 0 |
| 0.8201388888888889 | 0 |
| 0.8208333333333333 | 0 |
| 0.8215277777777777 | 0 |
| 0.8222222222222223 | 0 |
| 0.8229166666666666 | 0 |
| 0.8236111111111111 | 0 |
| 0.8243055555555556 | 0 |
| 0.8250000000000001 | 0 |
| 0.8256944444444444 | 0 |
| 0.8263888888888888 | 0 |
| 0.8270833333333334 | 0 |
| 0.8277777777777778 | 0 |
| 0.8284722222222222 | 0 |
| 0.8291666666666666 | 0 |
| 0.8298611111111112 | 0 |
| 0.8305555555555556 | 0 |
| 0.8312499999999999 | 0 |
| 0.8319444444444444 | 0 |
| 0.8326388888888889 | 0 |
| 0.8333333333333334 | 0 |
| 0.8340277777777777 | 0 |
| 0.8347222222222223 | 0 |
| 0.8354166666666667 | 0 |
| 0.8361111111111111 | 0 |
| 0.8368055555555555 | 0 |
| 0.8375 | 0 |
| 0.8381944444444445 | 0 |
| 0.8388888888888889 | 0 |
| 0.8395833333333332 | 0 |
| 0.8402777777777778 | 0 |
| 0.8409722222222222 | 0 |
| 0.8416666666666667 | 0 |
| 0.842361111111111 | 0 |
| 0.8430555555555556 | 0 |
| 0.84375 | 0 |
| 0.8444444444444444 | 0 |
| 0.845138888888889 | 0 |
| 0.8458333333333333 | 0 |
| 0.8465277777777778 | 0 |
| 0.8472222222222222 | 0 |
| 0.8479166666666668 | 0 |
| 0.8486111111111111 | 0 |
| 0.8493055555555555 | 0 |
| 0.85 | 0 |
| 0.8506944444444445 | 0 |
| 0.8513888888888889 | 0 |
| 0.8520833333333333 | 0 |
| 0.8527777777777777 | 0 |
| 0.8534722222222223 | 0 |
| 0.8541666666666666 | 0 |
| 0.8548611111111111 | 0 |
| 0.8555555555555556 | 0 |
| 0.8562500000000001 | 0 |
| 0.8569444444444444 | 0 |
| 0.8576388888888888 | 0 |
| 0.8583333333333334 | 0 |
| 0.8590277777777778 | 0 |
| 0.8597222222222222 | 0 |
| 0.8604166666666666 | 0 |
| 0.8611111111111112 | 0 |
| 0.8618055555555556 | 0 |
| 0.8624999999999999 | 0 |
| 0.8631944444444444 | 0 |
| 0.8638888888888889 | 0 |
| 0.8645833333333334 | 0 |
| 0.8652777777777777 | 0 |
| 0.8659722222222223 | 0 |
| 0.8666666666666667 | 0 |
| 0.8673611111111111 | 0 |
| 0.8680555555555555 | 0 |
| 0.86875 | 0 |
| 0.8694444444444445 | 0 |
| 0.8701388888888889 | 0 |
| 0.8708333333333332 | 0 |
| 0.8715277777777778 | 0 |
| 0.8722222222222222 | 0 |
| 0.8729166666666667 | 0 |
| 0.873611111111111 | 0 |
| 0.8743055555555556 | 0 |
| 0.875 | 0 |
| 0.8756944444444444 | 0 |
| 0.876388888888889 | 0 |
| 0.8770833333333333 | 0 |
| 0.8777777777777778 | 0 |
| 0.8784722222222222 | 0 |
| 0.8791666666666668 | 0 |
| 0.8798611111111111 | 0 |
| 0.8805555555555555 | 0 |
| 0.88125 | 0 |
| 0.8819444444444445 | 0 |
| 0.8826388888888889 | 0 |
| 0.8833333333333333 | 0 |
| 0.8840277777777777 | 0 |
| 0.8847222222222223 | 0 |
| 0.8854166666666666 | 0 |
| 0.8861111111111111 | 0 |
| 0.8868055555555556 | 0 |
| 0.8875000000000001 | 0 |
| 0.8881944444444444 | 0 |
| 0.8888888888888888 | 0 |
| 0.8895833333333334 | 0 |
| 0.8902777777777778 | 0 |
| 0.8909722222222222 | 0 |
| 0.8916666666666666 | 0 |
| 0.8923611111111112 | 0 |
| 0.8930555555555556 | 0 |
| 0.8937499999999999 | 0 |
| 0.8944444444444444 | 0 |
| 0.8951388888888889 | 0 |
| 0.8958333333333334 | 0 |
| 0.8965277777777777 | 0 |
| 0.8972222222222223 | 0 |
| 0.8979166666666667 | 0 |
| 0.8986111111111111 | 0 |
| 0.8993055555555555 | 0 |
| 0.9 | 0 |
| 0.9006944444444445 | 0 |
| 0.9013888888888889 | 0 |
| 0.9020833333333332 | 0 |
| 0.9027777777777778 | 0 |
| 0.9034722222222222 | 0 |
| 0.9041666666666667 | 0 |
| 0.904861111111111 | 0 |
| 0.9055555555555556 | 0 |
| 0.90625 | 0 |
| 0.9069444444444444 | 0 |
| 0.907638888888889 | 0 |
| 0.9083333333333333 | 0 |
| 0.9090277777777778 | 0 |
| 0.9097222222222222 | 0 |
| 0.9104166666666668 | 0 |
| 0.9111111111111111 | 0 |
| 0.9118055555555555 | 0 |
| 0.9125 | 0 |
| 0.9131944444444445 | 0 |
| 0.9138888888888889 | 0 |
| 0.9145833333333333 | 0 |
| 0.9152777777777777 | 0 |
| 0.9159722222222223 | 0 |
| 0.9166666666666666 | 0 |
| 0.9173611111111111 | 0 |
| 0.9180555555555556 | 0 |
| 0.9187500000000001 | 0 |
| 0.9194444444444444 | 0 |
| 0.9201388888888888 | 0 |
| 0.9208333333333334 | 0 |
| 0.9215277777777778 | 0 |
| 0.9222222222222222 | 0 |
| 0.9229166666666666 | 0 |
| 0.9236111111111112 | 0 |
| 0.9243055555555556 | 0 |
| 0.9249999999999999 | 0 |
| 0.9256944444444444 | 0 |
| 0.9263888888888889 | 0 |
| 0.9270833333333334 | 0 |
| 0.9277777777777777 | 0 |
| 0.9284722222222223 | 0 |
| 0.9291666666666667 | 0 |
| 0.9298611111111111 | 0 |
| 0.9305555555555555 | 0 |
| 0.93125 | 0 |
| 0.9319444444444445 | 0 |
| 0.9326388888888889 | 0 |
| 0.9333333333333332 | 0 |
| 0.9340277777777778 | 0 |
| 0.9347222222222222 | 0 |
| 0.9354166666666667 | 0 |
| 0.936111111111111 | 0 |
| 0.9368055555555556 | 0 |
| 0.9375 | 0 |
| 0.9381944444444444 | 0 |
| 0.938888888888889 | 0 |
| 0.9395833333333333 | 0 |
| 0.9402777777777778 | 0 |
| 0.9409722222222222 | 0 |
| 0.9416666666666668 | 0 |
| 0.9423611111111111 | 0 |
| 0.9430555555555555 | 0 |
| 0.94375 | 0 |
| 0.9444444444444445 | 0 |
| 0.9451388888888889 | 0 |
| 0.9458333333333333 | 0 |
| 0.9465277777777777 | 0 |
| 0.9472222222222223 | 0 |
| 0.9479166666666666 | 0 |
| 0.9486111111111111 | 0 |
| 0.9493055555555556 | 0 |
| 0.9500000000000001 | 0 |
| 0.9506944444444444 | 0 |
| 0.9513888888888888 | 0 |
| 0.9520833333333334 | 0 |
| 0.9527777777777778 | 0 |
| 0.9534722222222222 | 0 |
| 0.9541666666666666 | 0 |
| 0.9548611111111112 | 0 |
| 0.9555555555555556 | 0 |
| 0.9562499999999999 | 0 |
| 0.9569444444444444 | 0 |
| 0.9576388888888889 | 0 |
| 0.9583333333333334 | 0 |
| 0.9590277777777777 | 0 |
| 0.9597222222222223 | 0 |
| 0.9604166666666667 | 0 |
| 0.9611111111111111 | 0 |
| 0.9618055555555555 | 0 |
| 0.9625 | 0 |
| 0.9631944444444445 | 0 |
| 0.9638888888888889 | 0 |
| 0.9645833333333332 | 0 |
| 0.9652777777777778 | 0 |
| 0.9659722222222222 | 0 |
| 0.9666666666666667 | 0 |
| 0.967361111111111 | 0 |
| 0.9680555555555556 | 0 |
| 0.96875 | 0 |
| 0.9694444444444444 | 0 |
| 0.970138888888889 | 0 |
| 0.9708333333333333 | 0 |
| 0.9715277777777778 | 0 |
| 0.9722222222222222 | 0 |
| 0.9729166666666668 | 0 |
| 0.9736111111111111 | 0 |
| 0.9743055555555555 | 0 |
| 0.975 | 0 |
| 0.9756944444444445 | 0 |
| 0.9763888888888889 | 0 |
| 0.9770833333333333 | 0 |
| 0.9777777777777777 | 0 |
| 0.9784722222222223 | 0 |
| 0.9791666666666666 | 0 |
| 0.9798611111111111 | 0 |
| 0.9805555555555556 | 0 |
| 0.9812500000000001 | 0 |
| 0.9819444444444444 | 0 |
| 0.9826388888888888 | 0 |
| 0.9833333333333334 | 0 |
| 0.9840277777777778 | 0 |
| 0.9847222222222222 | 0 |
| 0.9854166666666666 | 0 |
| 0.9861111111111112 | 0 |
| 0.9868055555555556 | 0 |
| 0.9874999999999999 | 0 |
| 0.9881944444444444 | 0 |
| 0.9888888888888889 | 0 |
| 0.9895833333333334 | 0 |
| 0.9902777777777777 | 0 |
| 0.9909722222222223 | 0 |
| 0.9916666666666667 | 0 |
| 0.9923611111111111 | 0 |
| 0.9930555555555555 | 0 |
| 0.99375 | 0 |
| 0.9944444444444445 | 0 |
| 0.9951388888888889 | 0 |
| 0.9958333333333332 | 0 |
| 0.9965277777777778 | 0 |
| 0.9972222222222222 | 0 |
| 0.9979166666666667 | 0 |
| 0.998611111111111 | 0 |
| 0.9993055555555556 | 0 |